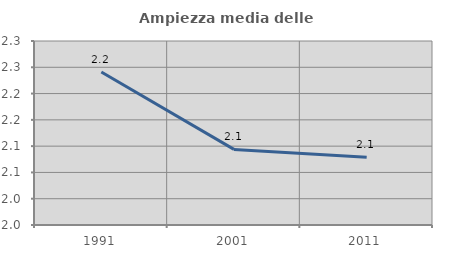
| Category | Ampiezza media delle famiglie |
|---|---|
| 1991.0 | 2.241 |
| 2001.0 | 2.094 |
| 2011.0 | 2.079 |